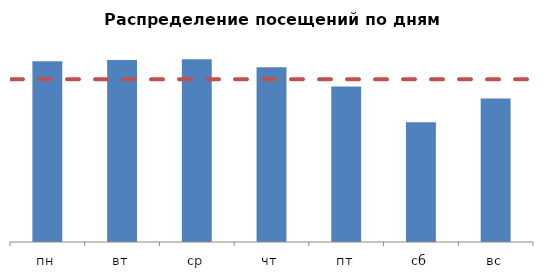
| Category | Доля посещений |
|---|---|
| пн | 0.159 |
| вт | 0.16 |
| ср | 0.16 |
| чт | 0.154 |
| пт | 0.136 |
| сб | 0.105 |
| вс | 0.126 |